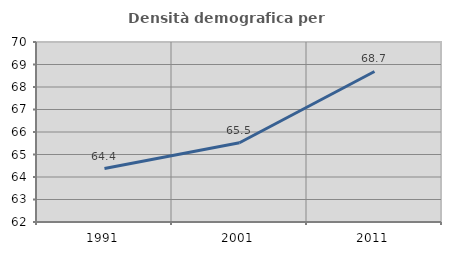
| Category | Densità demografica |
|---|---|
| 1991.0 | 64.376 |
| 2001.0 | 65.523 |
| 2011.0 | 68.689 |